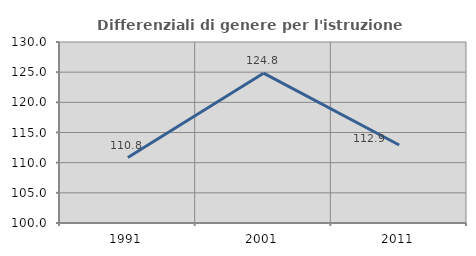
| Category | Differenziali di genere per l'istruzione superiore |
|---|---|
| 1991.0 | 110.848 |
| 2001.0 | 124.833 |
| 2011.0 | 112.926 |